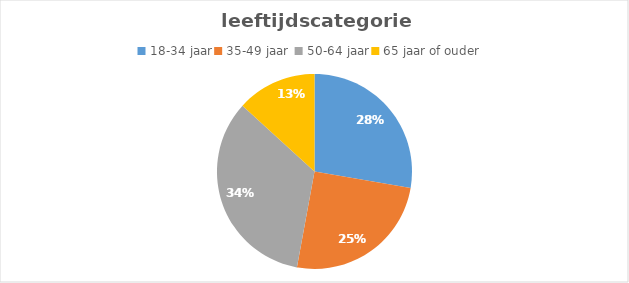
| Category | Series 0 |
|---|---|
| 18-34 jaar | 67 |
| 35-49 jaar  | 61 |
| 50-64 jaar | 82 |
| 65 jaar of ouder | 32 |